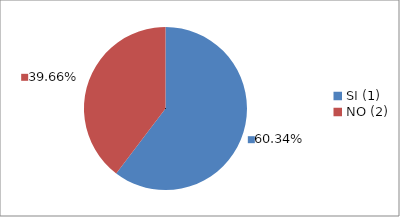
| Category | Series 0 |
|---|---|
| SI (1) | 0.603 |
| NO (2) | 0.397 |